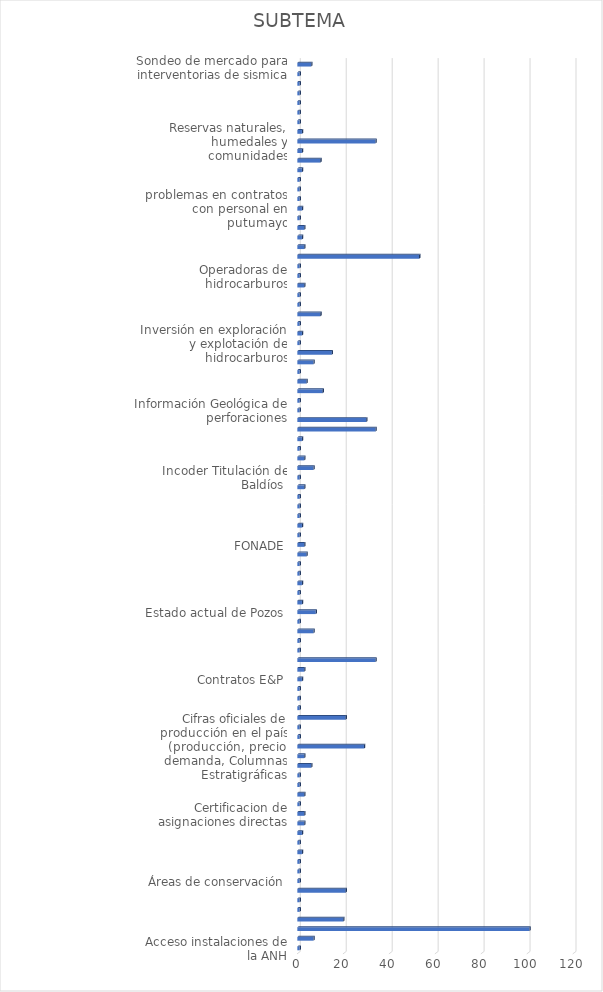
| Category | CANTIDAD |
|---|---|
| Acceso instalaciones de la ANH | 1 |
| Aclaración sobre los TEAs, E&P, Bloques | 7 |
| Acompañamiento a comunidad en desarrollo de proyecto (ambiental, social) | 101 |
| Actividad Hidrocarburífera en regiones del país | 20 |
| Adjudicación de predios baldíos | 1 |
| Archivo tipo shape | 1 |
| Áreas Asignadas, Áreas libres, reglamentación especial, requisitos y criterios para su asignación | 21 |
| Áreas de conservación | 1 |
| Áreas protegidas | 1 |
| Asignación de regalías | 1 |
| Beneficio de población y sus comunidades por actividad petrolera | 2 |
| Caracterización de parque metropolitano | 1 |
| Cartografía zonas Petrolera | 2 |
| Cartografía zonas Petrolera informacion sectorial offshore | 3 |
| Certificacion de asignaciones directas | 3 |
| Certificación de operación | 1 |
| certificacion de presencia de comunidades etnicas | 3 |
| Certificación laboral | 1 |
| Certificación sobre exploración o explotación de hidrocarburos  | 1 |
| Certificado  de trabajo realizado en estado de pozos | 6 |
| Certificado estado de pozos operador Petroantander | 3 |
| Cifras oficiales de producción en el país (producción, precio, demanda, Columnas Estratigráficas | 29 |
| competencia de la agencia nacional de mineria  | 1 |
| competencia de medio ambiente | 1 |
| Congreso de la República y Senado  | 21 |
| Consulta Proyecto de Ley Procedimiento Sancionatorio Ambiental | 1 |
| Contratación de empresas locales para explotación de hidrocarburos | 1 |
| Contratos con personal en putumayo | 1 |
| Contratos E&P | 2 |
| Contratos E&P, TEAS y Administrativos | 3 |
| Copias de contratos (E&P, TEAS y Administrativos) | 34 |
| Copias de contratos en el municipio de ovejas sucre | 1 |
| Correccion respecto al condicionamiento a la forma $CR del pozo chalupa-2 | 1 |
| Empresas con pozos en producción o exploración | 7 |
| Estado actual de contrato de hidrocarburos | 1 |
| Estado actual de Pozos | 8 |
| Estado de contrato de asociación | 2 |
| Estado de cumplimiento de contrato | 1 |
| Estudios geofísicos y de sísmica | 2 |
| Exploración de hidrocarburos | 1 |
| Fases de estado de contratos | 1 |
| Fiscalización  | 4 |
| FONADE | 3 |
| Formas de produccion bloque chiguiro | 1 |
| Fracking  | 2 |
| Gestion de cambio crédito BID | 1 |
| Histórico de perforación de pozos | 1 |
| identificacion:de tanques de almacenamiento subterraneo | 1 |
| Impacto y planes de manejo ambiental: Licencias, compromisos E&P normatividad, contaminación | 3 |
| Incoder Titulación de Baldíos  | 1 |
| Inconformidad por desarrollo irregular de proyecto | 7 |
| Información con fines Académicos (tesis de pregrado y postgrado) | 3 |
| informacion de estudios de sismica | 1 |
| Información de Operadores en Colombia | 2 |
| Información del trámite o proceso para pago de regalías | 34 |
| Información en formato shapefile acerca de las reservas naturales, humedales y comunidades | 30 |
| Información Geológica de perforaciones | 1 |
| informacion sobre pozos perforados en caqueta | 1 |
| Información y aclaración sobre los TEAs, E&P, Bloques | 11 |
| Informes sobres Consultas previas | 4 |
| Intervención para que compañía pague daños causados o tomar correctivos | 1 |
| Intervención para que operador vincule personal | 7 |
| Intervención por no pago a subcontratistas por parte de Operadoras  | 15 |
| Inversión en exploración y explotación de hidrocarburos | 1 |
| Inversión extranjera en Colombia | 2 |
| Liquidación y pago de regalias | 1 |
| Listas de Elegibles | 10 |
| Localización de área de explotación de hidrocarburos | 1 |
| Mapas de extracción de petróleo | 1 |
| Normatividad sobre exploración, regulación y producción de Hidrocarburos | 3 |
| Operadoras de hidrocarburos | 1 |
| Operadoras, tipo de formaciones, reservas | 1 |
| Otros | 53 |
| Planes de manejo ambiental: Licencias, compromisos E&P, normatividad contaminación | 3 |
| Pozos perforados en Caquetá | 2 |
| Probable existencia de yacimiento Petrolero | 3 |
| Problemas con oleoducto y falta de mantenimiento | 1 |
| problemas en contratos con personal en putumayo | 2 |
| Procesos financieros de la ANH | 1 |
| Pronunciamiento Tribunal Nariño | 1 |
| Quejas en contra de un operador (Perenco) | 1 |
| reglas para contratacion de mano de obra local en municipios de desarrollo E&P | 2 |
| Reliquidación de regalías | 10 |
| Requisitos para la exploración  | 2 |
| Reservas naturales, humedales y comunidades | 34 |
| Reservas probadas ó estimadas de Hidrocarburos en Colombia | 2 |
| Resoluciones que nombran y delegan representantes de la ANH | 1 |
| Sentencias de restitución | 1 |
| Sobretasa a la gasolina | 1 |
| solicitud de copias  | 1 |
| Sondeo de mercado para interventorias  | 1 |
| Sondeo de mercado para interventorias de sismica | 1 |
| Trámite o proceso para pago de regalías | 6 |